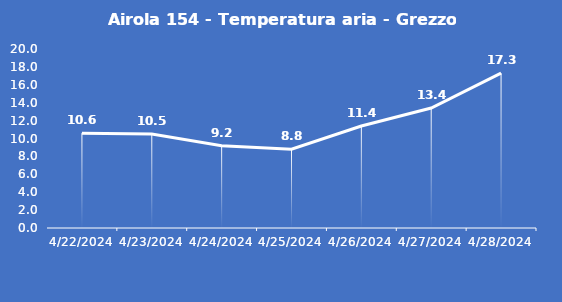
| Category | Airola 154 - Temperatura aria - Grezzo (°C) |
|---|---|
| 4/22/24 | 10.6 |
| 4/23/24 | 10.5 |
| 4/24/24 | 9.2 |
| 4/25/24 | 8.8 |
| 4/26/24 | 11.4 |
| 4/27/24 | 13.4 |
| 4/28/24 | 17.3 |